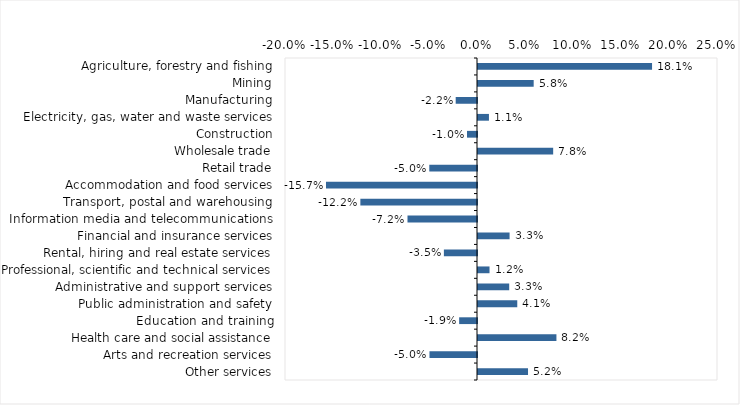
| Category | This week |
|---|---|
| Agriculture, forestry and fishing | 0.181 |
| Mining | 0.058 |
| Manufacturing | -0.022 |
| Electricity, gas, water and waste services | 0.011 |
| Construction | -0.01 |
| Wholesale trade | 0.078 |
| Retail trade | -0.05 |
| Accommodation and food services | -0.157 |
| Transport, postal and warehousing | -0.122 |
| Information media and telecommunications | -0.072 |
| Financial and insurance services | 0.033 |
| Rental, hiring and real estate services | -0.034 |
| Professional, scientific and technical services | 0.012 |
| Administrative and support services | 0.032 |
| Public administration and safety | 0.041 |
| Education and training | -0.019 |
| Health care and social assistance | 0.082 |
| Arts and recreation services | -0.05 |
| Other services | 0.052 |